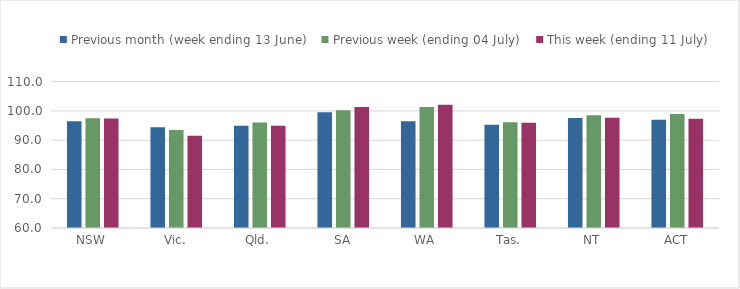
| Category | Previous month (week ending 13 June) | Previous week (ending 04 July) | This week (ending 11 July) |
|---|---|---|---|
| NSW | 96.501 | 97.463 | 97.414 |
| Vic. | 94.38 | 93.456 | 91.494 |
| Qld. | 94.905 | 96.061 | 94.918 |
| SA | 99.505 | 100.257 | 101.33 |
| WA | 96.509 | 101.341 | 102.103 |
| Tas. | 95.311 | 96.154 | 95.926 |
| NT | 97.581 | 98.488 | 97.663 |
| ACT | 97.021 | 98.918 | 97.347 |